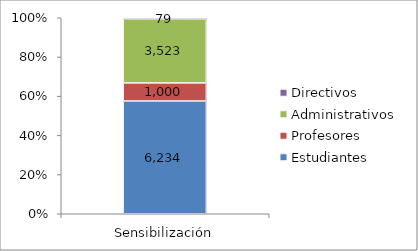
| Category | Estudiantes | Profesores | Administrativos  | Directivos |
|---|---|---|---|---|
| Sensibilización | 6234 | 1000 | 3523 | 79 |